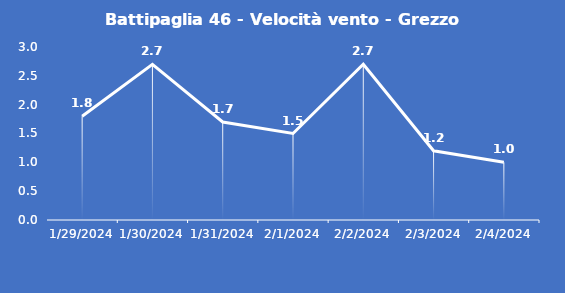
| Category | Battipaglia 46 - Velocità vento - Grezzo (m/s) |
|---|---|
| 1/29/24 | 1.8 |
| 1/30/24 | 2.7 |
| 1/31/24 | 1.7 |
| 2/1/24 | 1.5 |
| 2/2/24 | 2.7 |
| 2/3/24 | 1.2 |
| 2/4/24 | 1 |